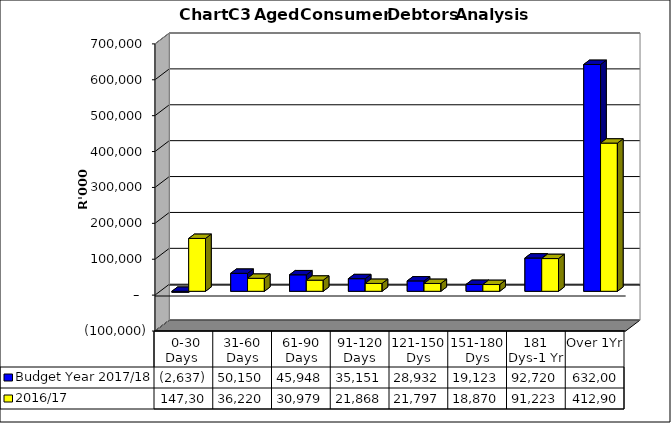
| Category | Budget Year 2017/18 | 2016/17 |
|---|---|---|
|  0-30 Days  | -2636606.91 | 147302323.17 |
| 31-60 Days | 50150364.24 | 36219973.95 |
| 61-90 Days | 45948066.54 | 30979289.84 |
| 91-120 Days | 35150622.36 | 21867957.38 |
| 121-150 Dys | 28932318.32 | 21797086.1 |
| 151-180 Dys | 19122509.8 | 18870118.85 |
| 181 Dys-1 Yr | 92720495.05 | 91223084.91 |
| Over 1Yr | 632004209.6 | 412899967.63 |